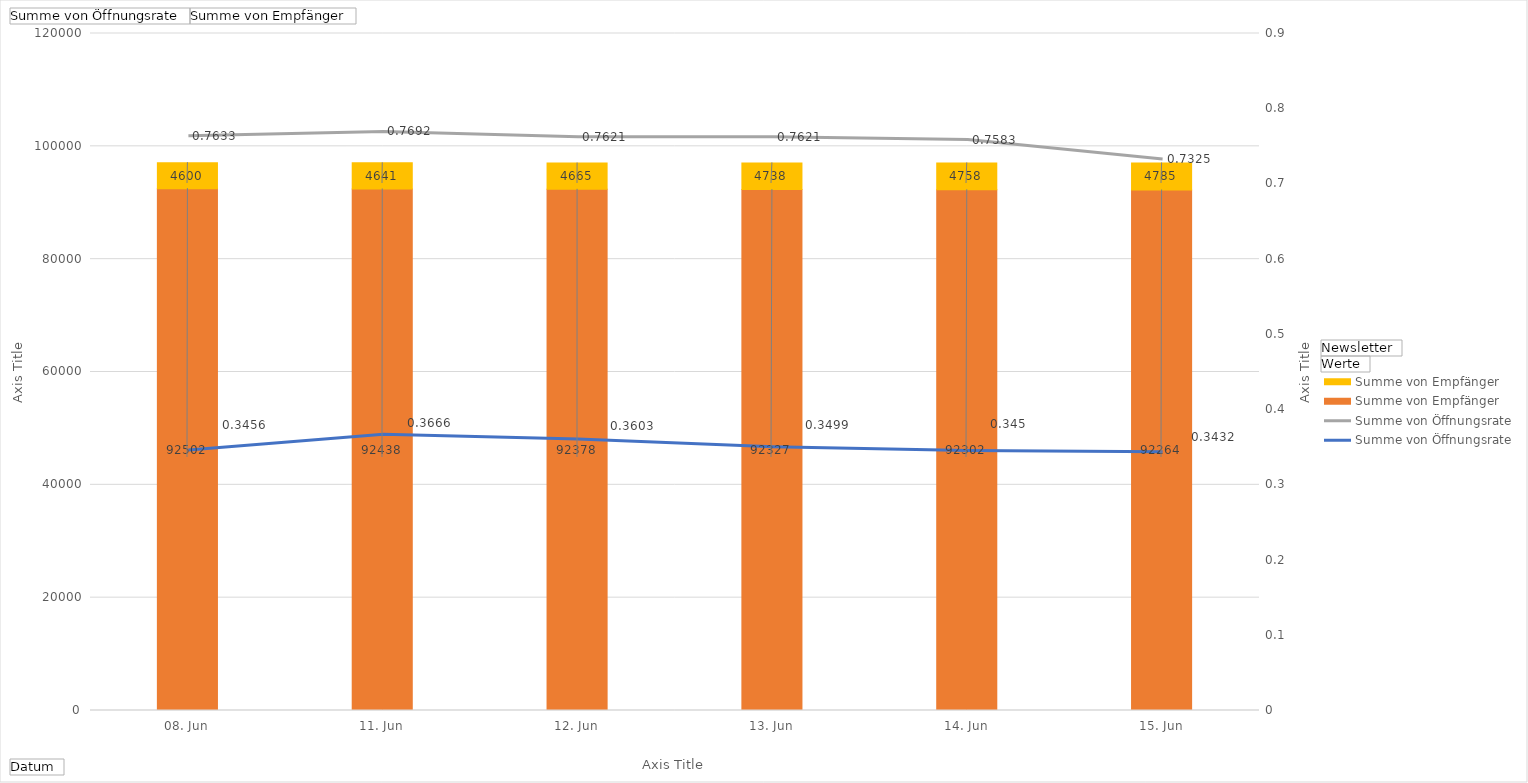
| Category | Mail_1 - Summe von Empfänger | Mail_2 - Summe von Empfänger |
|---|---|---|
| 08. Jun | 92502 | 4600 |
| 11. Jun | 92438 | 4641 |
| 12. Jun | 92378 | 4665 |
| 13. Jun | 92327 | 4738 |
| 14. Jun | 92302 | 4758 |
| 15. Jun | 92264 | 4785 |